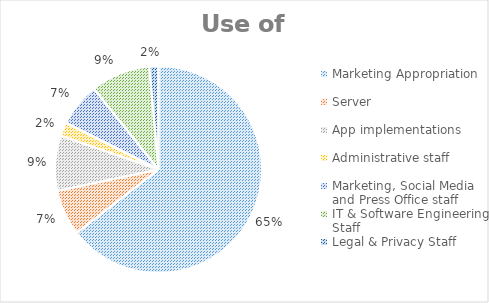
| Category | Series 0 |
|---|---|
| Marketing Appropriation | 0.645 |
| Server | 0.072 |
| App implementations | 0.086 |
| Administrative staff | 0.022 |
| Marketing, Social Media and Press Office staff | 0.068 |
| IT & Software Engineering Staff | 0.093 |
| Legal & Privacy Staff | 0.014 |